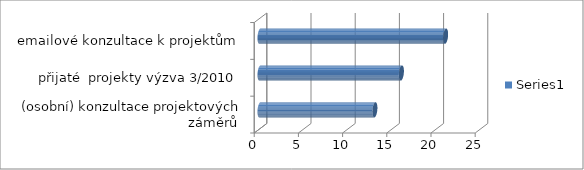
| Category | Series 0 |
|---|---|
| (osobní) konzultace projektových záměrů  | 13 |
| přijaté  projekty výzva 3/2010 | 16 |
| emailové konzultace k projektům | 21 |